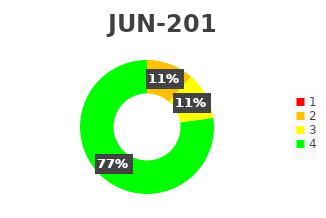
| Category | Series 0 |
|---|---|
| 1.0 | 0 |
| 2.0 | 4 |
| 3.0 | 4 |
| 4.0 | 27 |